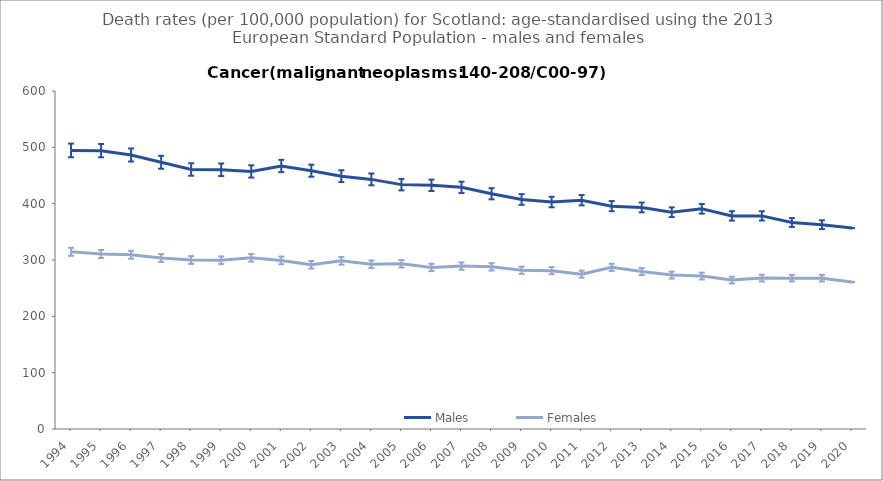
| Category | Males | Females |
|---|---|---|
| 1994.0 | 494.5 | 314.6 |
| 1995.0 | 494.1 | 310.7 |
| 1996.0 | 486.4 | 309.3 |
| 1997.0 | 473.5 | 303.5 |
| 1998.0 | 460.7 | 300 |
| 1999.0 | 460.2 | 299.5 |
| 2000.0 | 457.2 | 303.9 |
| 2001.0 | 466.9 | 299.3 |
| 2002.0 | 458.5 | 291.6 |
| 2003.0 | 448.8 | 298.5 |
| 2004.0 | 443.1 | 292.4 |
| 2005.0 | 433.8 | 293.3 |
| 2006.0 | 432.6 | 286.8 |
| 2007.0 | 429 | 289.2 |
| 2008.0 | 417.6 | 287.8 |
| 2009.0 | 407.4 | 281.8 |
| 2010.0 | 402.9 | 281.1 |
| 2011.0 | 406.2 | 274.8 |
| 2012.0 | 395.6 | 286.9 |
| 2013.0 | 393.3 | 279.5 |
| 2014.0 | 384.8 | 273.2 |
| 2015.0 | 390.9 | 271.5 |
| 2016.0 | 378.3 | 264.3 |
| 2017.0 | 378.3 | 267.9 |
| 2018.0 | 366.6 | 267.8 |
| 2019.0 | 362.6 | 267.8 |
| 2020.0 | 356.6 | 260.8 |